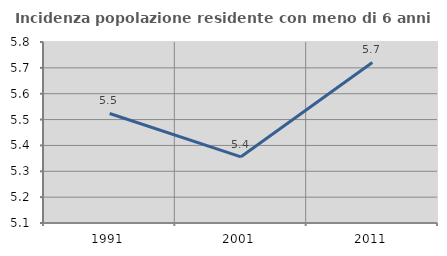
| Category | Incidenza popolazione residente con meno di 6 anni |
|---|---|
| 1991.0 | 5.524 |
| 2001.0 | 5.356 |
| 2011.0 | 5.721 |